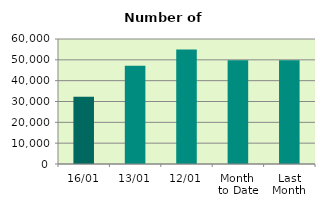
| Category | Series 0 |
|---|---|
| 16/01 | 32256 |
| 13/01 | 47140 |
| 12/01 | 55000 |
| Month 
to Date | 49815.4 |
| Last
Month | 49764 |